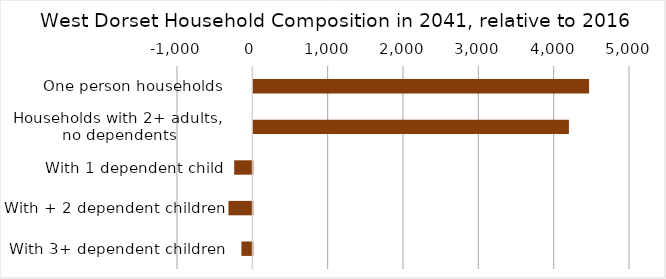
| Category | Change |
|---|---|
| One person households | 4457 |
| Households with 2+ adults,
 no dependents | 4189 |
| With 1 dependent child | -241 |
| With + 2 dependent children | -317 |
| With 3+ dependent children | -145 |